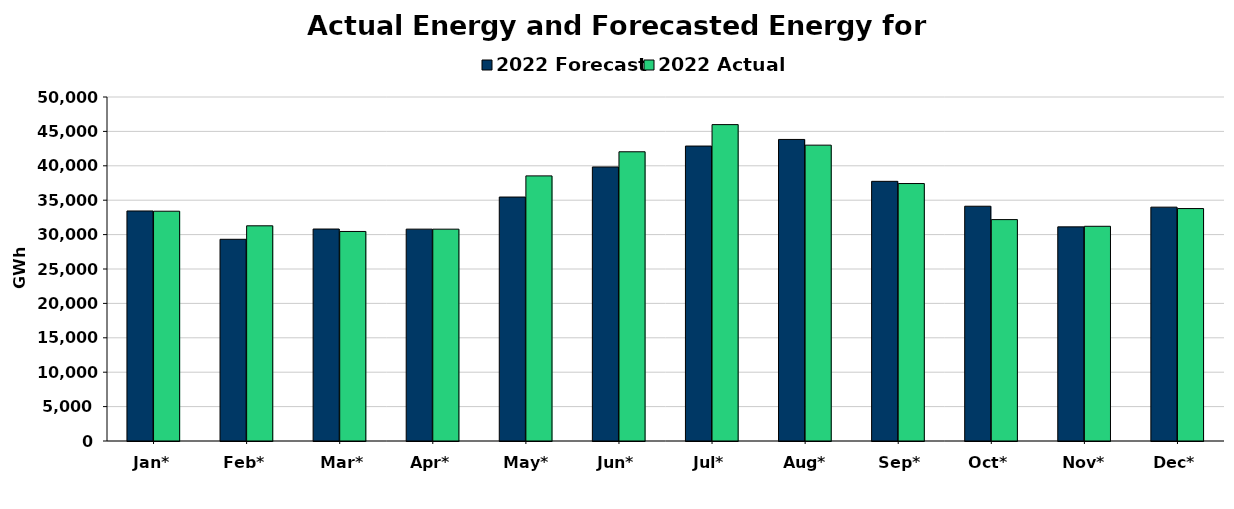
| Category | 2022 Forecast | 2022 Actual |
|---|---|---|
| Jan* | 33434 | 33400 |
| Feb* | 29318 | 31279 |
| Mar* | 30811 | 30457 |
| Apr* | 30795 | 30790 |
| May* | 35460 | 38535 |
| Jun* | 39832 | 42039 |
| Jul* | 42871 | 45986 |
| Aug* | 43830 | 43002 |
| Sep* | 37741 | 37422 |
| Oct* | 34123 | 32179 |
| Nov* | 31125 | 31209 |
| Dec* | 33991 | 33786 |